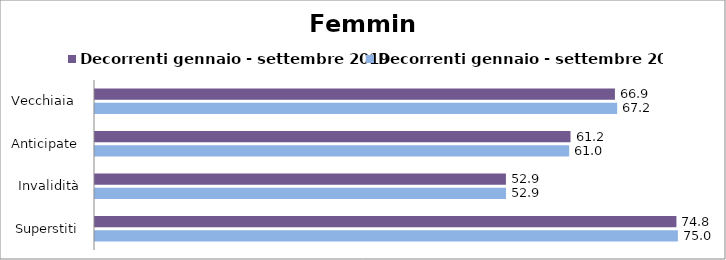
| Category | Decorrenti gennaio - settembre 2019 | Decorrenti gennaio - settembre 2020 |
|---|---|---|
| Vecchiaia  | 66.87 | 67.16 |
| Anticipate | 61.16 | 60.99 |
| Invalidità | 52.85 | 52.86 |
| Superstiti | 74.78 | 74.97 |